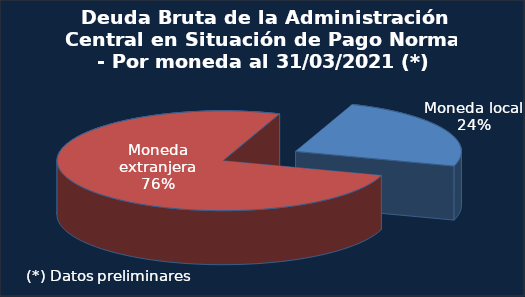
| Category | Series 0 |
|---|---|
| Moneda local (1) | 0.242 |
| Moneda extranjera | 0.758 |